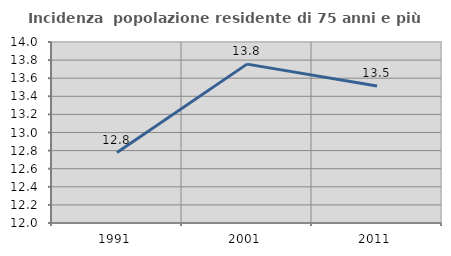
| Category | Incidenza  popolazione residente di 75 anni e più |
|---|---|
| 1991.0 | 12.779 |
| 2001.0 | 13.755 |
| 2011.0 | 13.514 |